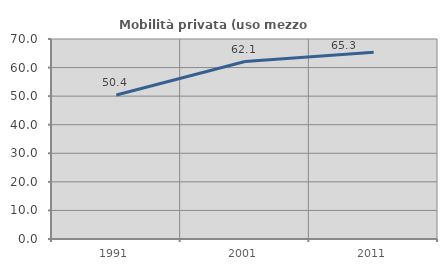
| Category | Mobilità privata (uso mezzo privato) |
|---|---|
| 1991.0 | 50.387 |
| 2001.0 | 62.125 |
| 2011.0 | 65.334 |